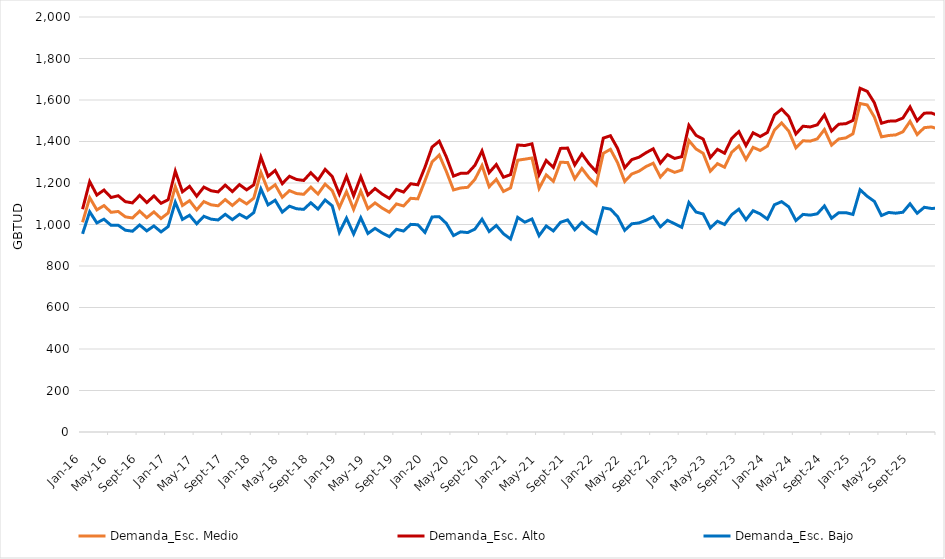
| Category | Demanda_Esc. Medio | Demanda_Esc. Alto | Demanda_Esc. Bajo |
|---|---|---|---|
| 2016-01-01 | 1010.734 | 1073.666 | 954.927 |
| 2016-02-01 | 1129.307 | 1206.771 | 1061.351 |
| 2016-03-01 | 1070.503 | 1141.976 | 1007.813 |
| 2016-04-01 | 1091.194 | 1166.019 | 1025.488 |
| 2016-05-01 | 1058.716 | 1130.053 | 996.106 |
| 2016-06-01 | 1062.896 | 1138.586 | 996.35 |
| 2016-07-01 | 1036.852 | 1109.979 | 972.544 |
| 2016-08-01 | 1031.51 | 1104.188 | 967.604 |
| 2016-09-01 | 1064.389 | 1140.237 | 997.738 |
| 2016-10-01 | 1032.934 | 1105.468 | 969.232 |
| 2016-11-01 | 1060.719 | 1137.541 | 993.082 |
| 2016-12-01 | 1028.868 | 1102.286 | 964.366 |
| 2017-01-01 | 1055.533 | 1119.613 | 990.168 |
| 2017-02-01 | 1182.94 | 1257.065 | 1107.383 |
| 2017-03-01 | 1091.685 | 1157.569 | 1024.487 |
| 2017-04-01 | 1114.927 | 1183.891 | 1044.609 |
| 2017-05-01 | 1070.676 | 1136.464 | 1003.592 |
| 2017-06-01 | 1110.465 | 1180.046 | 1039.523 |
| 2017-07-01 | 1095.1 | 1162.852 | 1026.01 |
| 2017-08-01 | 1090.134 | 1157.118 | 1021.824 |
| 2017-09-01 | 1120.131 | 1189.828 | 1049.068 |
| 2017-10-01 | 1091.687 | 1158.751 | 1023.299 |
| 2017-11-01 | 1121.367 | 1192.191 | 1049.162 |
| 2017-12-01 | 1099.397 | 1166.949 | 1030.51 |
| 2018-01-01 | 1126.968 | 1191.274 | 1057.305 |
| 2018-02-01 | 1250.93 | 1324.812 | 1171.54 |
| 2018-03-01 | 1165.912 | 1231.791 | 1094.654 |
| 2018-04-01 | 1191.479 | 1260.55 | 1116.982 |
| 2018-05-01 | 1131.034 | 1196.868 | 1059.825 |
| 2018-06-01 | 1163.107 | 1232.478 | 1088.309 |
| 2018-07-01 | 1149.161 | 1216.905 | 1075.856 |
| 2018-08-01 | 1145.409 | 1212.289 | 1072.98 |
| 2018-09-01 | 1179.977 | 1249.577 | 1104.785 |
| 2018-10-01 | 1146.779 | 1213.794 | 1074.213 |
| 2018-11-01 | 1194.549 | 1265.261 | 1118.231 |
| 2018-12-01 | 1163.364 | 1231.08 | 1090.087 |
| 2019-01-01 | 1081.791 | 1146.138 | 962.053 |
| 2019-02-01 | 1158.506 | 1232.493 | 1030.717 |
| 2019-03-01 | 1072.963 | 1138.578 | 954.183 |
| 2019-04-01 | 1161.351 | 1230.205 | 1032.548 |
| 2019-05-01 | 1076.207 | 1142.015 | 956.84 |
| 2019-06-01 | 1103.993 | 1173.377 | 981.337 |
| 2019-07-01 | 1079.179 | 1146.661 | 959.28 |
| 2019-08-01 | 1059.191 | 1126.086 | 941.435 |
| 2019-09-01 | 1099.147 | 1168.914 | 976.958 |
| 2019-10-01 | 1089.284 | 1156.364 | 968.533 |
| 2019-11-01 | 1126.177 | 1196.397 | 1000.649 |
| 2019-12-01 | 1123.641 | 1191.227 | 998.837 |
| 2020-01-01 | 1210.807 | 1276.028 | 961.752 |
| 2020-02-01 | 1301.318 | 1373.492 | 1036.386 |
| 2020-03-01 | 1334.861 | 1401.444 | 1037.672 |
| 2020-04-01 | 1255.354 | 1325.206 | 1005.178 |
| 2020-05-01 | 1166.569 | 1233.266 | 946.688 |
| 2020-06-01 | 1176.075 | 1246.52 | 964.435 |
| 2020-07-01 | 1179.229 | 1247.702 | 961.131 |
| 2020-08-01 | 1217.613 | 1285.077 | 977.865 |
| 2020-09-01 | 1283.98 | 1354.614 | 1025.438 |
| 2020-10-01 | 1181.967 | 1249.874 | 966.271 |
| 2020-11-01 | 1217.621 | 1288.957 | 995.399 |
| 2020-12-01 | 1159.326 | 1227.745 | 955.452 |
| 2021-01-01 | 1176.1 | 1240.455 | 929.97 |
| 2021-02-01 | 1309.784 | 1383.254 | 1034.27 |
| 2021-03-01 | 1314.858 | 1380.551 | 1011.142 |
| 2021-04-01 | 1320.409 | 1388.934 | 1026.539 |
| 2021-05-01 | 1173.871 | 1239.619 | 946.167 |
| 2021-06-01 | 1239.173 | 1308.541 | 992.898 |
| 2021-07-01 | 1208.003 | 1275.142 | 969.106 |
| 2021-08-01 | 1300.05 | 1366.729 | 1010.59 |
| 2021-09-01 | 1298.768 | 1368.273 | 1022.029 |
| 2021-10-01 | 1220.357 | 1287.12 | 974.453 |
| 2021-11-01 | 1269.991 | 1340.315 | 1010.505 |
| 2021-12-01 | 1225.21 | 1292.675 | 979.6 |
| 2022-01-01 | 1190.604 | 1255.019 | 957.078 |
| 2022-02-01 | 1342.895 | 1416.52 | 1080.712 |
| 2022-03-01 | 1362.309 | 1427.943 | 1073.9 |
| 2022-04-01 | 1298.144 | 1366.681 | 1038.122 |
| 2022-05-01 | 1207.469 | 1273.385 | 971.921 |
| 2022-06-01 | 1243.558 | 1312.842 | 1003.422 |
| 2022-07-01 | 1256.961 | 1324.156 | 1007.561 |
| 2022-08-01 | 1279.4 | 1346.091 | 1020.442 |
| 2022-09-01 | 1295.374 | 1364.85 | 1037.904 |
| 2022-10-01 | 1228.807 | 1295.747 | 988.901 |
| 2022-11-01 | 1266.389 | 1336.625 | 1020.114 |
| 2022-12-01 | 1251.239 | 1318.463 | 1003.748 |
| 2023-01-01 | 1262.478 | 1326.84 | 986.557 |
| 2023-02-01 | 1404.571 | 1478.161 | 1105.971 |
| 2023-03-01 | 1363.894 | 1429.611 | 1060.013 |
| 2023-04-01 | 1343.03 | 1411.66 | 1050.946 |
| 2023-05-01 | 1256.795 | 1322.509 | 983.548 |
| 2023-06-01 | 1293.133 | 1362.289 | 1015.703 |
| 2023-07-01 | 1276.142 | 1343.458 | 1000.141 |
| 2023-08-01 | 1347.934 | 1414.549 | 1047.172 |
| 2023-09-01 | 1378.46 | 1447.656 | 1073.717 |
| 2023-10-01 | 1313.493 | 1380.359 | 1022.858 |
| 2023-11-01 | 1371.772 | 1441.958 | 1066.634 |
| 2023-12-01 | 1356.754 | 1424.013 | 1050.923 |
| 2024-01-01 | 1377.871 | 1443.393 | 1026.099 |
| 2024-02-01 | 1455.654 | 1527.932 | 1095.296 |
| 2024-03-01 | 1489.41 | 1556.1 | 1110.142 |
| 2024-04-01 | 1449.843 | 1519.733 | 1085.119 |
| 2024-05-01 | 1369.593 | 1436.443 | 1019.163 |
| 2024-06-01 | 1403.612 | 1473.699 | 1048.695 |
| 2024-07-01 | 1401.677 | 1470.092 | 1045.122 |
| 2024-08-01 | 1412.672 | 1480.321 | 1051.513 |
| 2024-09-01 | 1457.694 | 1527.971 | 1089.495 |
| 2024-10-01 | 1382.399 | 1450.324 | 1030.078 |
| 2024-11-01 | 1412.016 | 1483.245 | 1056.813 |
| 2024-12-01 | 1417.388 | 1485.849 | 1057.054 |
| 2025-01-01 | 1437.206 | 1501.626 | 1048.497 |
| 2025-02-01 | 1583.161 | 1656.615 | 1167.462 |
| 2025-03-01 | 1576.068 | 1641.625 | 1135.836 |
| 2025-04-01 | 1518.044 | 1586.652 | 1111.231 |
| 2025-05-01 | 1422.39 | 1488.017 | 1043.249 |
| 2025-06-01 | 1428.958 | 1498.005 | 1058.043 |
| 2025-07-01 | 1431.829 | 1498.984 | 1054.525 |
| 2025-08-01 | 1446.816 | 1513.091 | 1059.126 |
| 2025-09-01 | 1497.201 | 1566.491 | 1099.843 |
| 2025-10-01 | 1433.348 | 1500.071 | 1054.19 |
| 2025-11-01 | 1466.76 | 1536.581 | 1083.051 |
| 2025-12-01 | 1470.209 | 1537.321 | 1077.203 |
| 2026-01-01 | 1460.018 | 1524.452 | 1078.923 |
| 2026-02-01 | 1611.201 | 1684.484 | 1201.848 |
| 2026-03-01 | 1662.268 | 1727.846 | 1207.002 |
| 2026-04-01 | 1529.855 | 1598.372 | 1135.643 |
| 2026-05-01 | 1393.097 | 1458.549 | 1040.894 |
| 2026-06-01 | 1439.412 | 1508.547 | 1081.519 |
| 2026-07-01 | 1446.974 | 1513.94 | 1079.342 |
| 2026-08-01 | 1422.571 | 1489.043 | 1062.058 |
| 2026-09-01 | 1477.904 | 1547.074 | 1104.787 |
| 2026-10-01 | 1418.577 | 1485.24 | 1061.282 |
| 2026-11-01 | 1465.107 | 1534.959 | 1098.739 |
| 2026-12-01 | 1472.501 | 1539.637 | 1095.606 |
| 2027-01-01 | 1486.915 | 1551.326 | 1104.921 |
| 2027-02-01 | 1609.784 | 1683.113 | 1211.551 |
| 2027-03-01 | 1621.972 | 1687.467 | 1189.263 |
| 2027-04-01 | 1518.804 | 1587.188 | 1138.469 |
| 2027-05-01 | 1421.855 | 1487.447 | 1070.303 |
| 2027-06-01 | 1457.836 | 1526.809 | 1103.563 |
| 2027-07-01 | 1447.861 | 1514.64 | 1089.975 |
| 2027-08-01 | 1470.638 | 1537.082 | 1101.643 |
| 2027-09-01 | 1546.303 | 1615.391 | 1156.175 |
| 2027-10-01 | 1449.257 | 1515.819 | 1090.339 |
| 2027-11-01 | 1496.55 | 1566.304 | 1128.321 |
| 2027-12-01 | 1540.019 | 1607.043 | 1145.463 |
| 2028-01-01 | 1579.642 | 1645.124 | 1142.03 |
| 2028-02-01 | 1698.531 | 1770.534 | 1233.662 |
| 2028-03-01 | 1672.488 | 1739.147 | 1194.126 |
| 2028-04-01 | 1625.223 | 1694.673 | 1183.787 |
| 2028-05-01 | 1468.065 | 1534.962 | 1093.495 |
| 2028-06-01 | 1474.776 | 1544.872 | 1111.574 |
| 2028-07-01 | 1510.049 | 1578.062 | 1119.612 |
| 2028-08-01 | 1579.521 | 1647.009 | 1149.954 |
| 2028-09-01 | 1613.945 | 1684.133 | 1180.04 |
| 2028-10-01 | 1499.155 | 1567.014 | 1113.839 |
| 2028-11-01 | 1526.269 | 1597.156 | 1139.72 |
| 2028-12-01 | 1581.357 | 1649.326 | 1153.63 |
| 2029-01-01 | 1643.929 | 1708.167 | 1163.436 |
| 2029-02-01 | 1783.756 | 1856.923 | 1277.45 |
| 2029-03-01 | 1770.807 | 1836.179 | 1226.236 |
| 2029-04-01 | 1684.253 | 1752.379 | 1203.385 |
| 2029-05-01 | 1478.875 | 1544.539 | 1098.904 |
| 2029-06-01 | 1532.3 | 1601.061 | 1139.071 |
| 2029-07-01 | 1608.931 | 1675.602 | 1161.547 |
| 2029-08-01 | 1585.265 | 1651.512 | 1147.294 |
| 2029-09-01 | 1702.886 | 1771.717 | 1213.497 |
| 2029-10-01 | 1587.314 | 1653.834 | 1151.604 |
| 2029-11-01 | 1632.369 | 1701.854 | 1185.727 |
| 2029-12-01 | 1654.417 | 1721.072 | 1180.314 |
| 2030-01-01 | 1695.054 | 1760.315 | 1187.565 |
| 2030-02-01 | 1805.447 | 1879.806 | 1290.165 |
| 2030-03-01 | 1798.585 | 1865.013 | 1238.469 |
| 2030-04-01 | 1746.679 | 1815.866 | 1232.793 |
| 2030-05-01 | 1524.95 | 1591.632 | 1124.974 |
| 2030-06-01 | 1601.767 | 1671.568 | 1174.741 |
| 2030-07-01 | 1689.446 | 1757.115 | 1199.265 |
| 2030-08-01 | 1672.473 | 1739.699 | 1187.994 |
| 2030-09-01 | 1751.721 | 1821.601 | 1236.862 |
| 2030-10-01 | 1617.666 | 1685.213 | 1169.052 |
| 2030-11-01 | 1702.637 | 1773.147 | 1219.573 |
| 2030-12-01 | 1728.84 | 1796.471 | 1214.276 |
| 2031-01-01 | 1573.363 | 1638.775 | 1176.959 |
| 2031-02-01 | 1700.972 | 1775.469 | 1289.387 |
| 2031-03-01 | 1673.69 | 1740.237 | 1236.951 |
| 2031-04-01 | 1627.603 | 1696.913 | 1224.412 |
| 2031-05-01 | 1501.718 | 1568.438 | 1144.162 |
| 2031-06-01 | 1558.252 | 1628.101 | 1188.372 |
| 2031-07-01 | 1587.404 | 1655.164 | 1195.153 |
| 2031-08-01 | 1589.818 | 1657.111 | 1193.063 |
| 2031-09-01 | 1652.308 | 1722.255 | 1238.983 |
| 2031-10-01 | 1605.832 | 1673.368 | 1204.358 |
| 2031-11-01 | 1622.794 | 1693.346 | 1225.378 |
| 2031-12-01 | 1600.07 | 1667.772 | 1200.87 |
| 2032-01-01 | 1538.7 | 1604.152 | 1169.828 |
| 2032-02-01 | 1671.189 | 1745.716 | 1285.916 |
| 2032-03-01 | 1646.445 | 1713.05 | 1235.247 |
| 2032-04-01 | 1619.301 | 1688.649 | 1232.276 |
| 2032-05-01 | 1500.797 | 1567.537 | 1154.577 |
| 2032-06-01 | 1546.219 | 1616.089 | 1193.187 |
| 2032-07-01 | 1533.004 | 1600.808 | 1177.243 |
| 2032-08-01 | 1545.077 | 1612.392 | 1180.473 |
| 2032-09-01 | 1614.63 | 1684.582 | 1230.848 |
| 2032-10-01 | 1575.548 | 1643.074 | 1199.804 |
| 2032-11-01 | 1598.833 | 1669.358 | 1224.274 |
| 2032-12-01 | 1551.573 | 1619.265 | 1186.214 |
| 2033-01-01 | 1547.896 | 1613.415 | 1177.928 |
| 2033-02-01 | 1681.526 | 1756.125 | 1295.004 |
| 2033-03-01 | 1648.903 | 1715.521 | 1237.165 |
| 2033-04-01 | 1625.894 | 1695.244 | 1238.145 |
| 2033-05-01 | 1503.294 | 1570.03 | 1160.316 |
| 2033-06-01 | 1540.392 | 1610.26 | 1194.59 |
| 2033-07-01 | 1531.75 | 1599.546 | 1180.574 |
| 2033-08-01 | 1546.801 | 1614.097 | 1184.69 |
| 2033-09-01 | 1610.483 | 1680.411 | 1231.184 |
| 2033-10-01 | 1580.877 | 1648.36 | 1205.177 |
| 2033-11-01 | 1577.508 | 1648.006 | 1216.211 |
| 2033-12-01 | 1544.981 | 1612.624 | 1185.92 |
| 2034-01-01 | 1558.484 | 1624.04 | 1188.725 |
| 2034-02-01 | 1703.91 | 1778.534 | 1312.352 |
| 2034-03-01 | 1660.613 | 1727.255 | 1247.552 |
| 2034-04-01 | 1631.583 | 1700.955 | 1246.318 |
| 2034-05-01 | 1494.582 | 1561.347 | 1162.001 |
| 2034-06-01 | 1541.163 | 1611.042 | 1201.289 |
| 2034-07-01 | 1558.838 | 1626.612 | 1200.259 |
| 2034-08-01 | 1558.217 | 1625.5 | 1196.046 |
| 2034-09-01 | 1643.216 | 1713.104 | 1253.156 |
| 2034-10-01 | 1597.42 | 1664.87 | 1218.757 |
| 2034-11-01 | 1604.827 | 1675.27 | 1235.848 |
| 2034-12-01 | 1569.326 | 1636.91 | 1203.794 |
| 2035-01-01 | 1580.817 | 1646.409 | 1204.987 |
| 2035-02-01 | 1710.073 | 1784.748 | 1321.01 |
| 2035-03-01 | 1675.869 | 1742.539 | 1259.409 |
| 2035-04-01 | 1662.086 | 1731.463 | 1266.577 |
| 2035-05-01 | 1508.899 | 1575.673 | 1175.044 |
| 2035-06-01 | 1560.985 | 1630.859 | 1217.149 |
| 2035-07-01 | 1590.987 | 1658.738 | 1221.623 |
| 2035-08-01 | 1590.911 | 1658.162 | 1217.503 |
| 2035-09-01 | 1658.051 | 1727.916 | 1265.343 |
| 2035-10-01 | 1617.634 | 1685.047 | 1233.618 |
| 2035-11-01 | 1635.062 | 1705.448 | 1256.101 |
| 2035-12-01 | 1602.58 | 1670.098 | 1225.331 |
| 2036-01-01 | 1549.137 | 1614.82 | 1203.823 |
| 2036-02-01 | 1683.291 | 1758.052 | 1323.545 |
| 2036-03-01 | 1632.036 | 1698.784 | 1255.604 |
| 2036-04-01 | 1630.122 | 1699.562 | 1267.074 |
| 2036-05-01 | 1506.689 | 1573.488 | 1185.745 |
| 2036-06-01 | 1556.436 | 1626.329 | 1227.427 |
| 2036-07-01 | 1577.77 | 1645.538 | 1229.81 |
| 2036-08-01 | 1586.287 | 1653.535 | 1230.794 |
| 2036-09-01 | 1656.435 | 1726.284 | 1282.081 |
| 2036-10-01 | 1644.432 | 1711.795 | 1265.176 |
| 2036-11-01 | 1638.036 | 1708.382 | 1273.934 |
| 2036-12-01 | 1587.142 | 1654.628 | 1233.043 |
| 2037-01-01 | 1534.164 | 1599.919 | 1200.692 |
| 2037-02-01 | 1674.336 | 1749.161 | 1324.343 |
| 2037-03-01 | 1620.362 | 1687.157 | 1254.888 |
| 2037-04-01 | 1628.526 | 1697.997 | 1271.748 |
| 2037-05-01 | 1522.42 | 1589.221 | 1199.077 |
| 2037-06-01 | 1569.541 | 1639.431 | 1239.507 |
| 2037-07-01 | 1573.588 | 1641.357 | 1232.554 |
| 2037-08-01 | 1578.027 | 1645.272 | 1231.361 |
| 2037-09-01 | 1653.444 | 1723.274 | 1285.988 |
| 2037-10-01 | 1672.536 | 1739.845 | 1286.418 |
| 2037-11-01 | 1636.037 | 1706.345 | 1278.125 |
| 2037-12-01 | 1558.239 | 1625.705 | 1221.967 |
| 2038-01-01 | 1536.161 | 1601.964 | 1206.127 |
| 2038-02-01 | 1681.925 | 1756.791 | 1333.478 |
| 2038-03-01 | 1609.641 | 1676.479 | 1253.724 |
| 2038-04-01 | 1625.366 | 1694.866 | 1274.718 |
| 2038-05-01 | 1525.071 | 1591.886 | 1204.582 |
| 2038-06-01 | 1572.202 | 1642.098 | 1245.171 |
| 2038-07-01 | 1573.254 | 1641.022 | 1236.667 |
| 2038-08-01 | 1585.739 | 1652.968 | 1240.085 |
| 2038-09-01 | 1650.226 | 1720.041 | 1288.95 |
| 2038-10-01 | 1671.377 | 1738.661 | 1290.841 |
| 2038-11-01 | 1625.432 | 1695.714 | 1276.665 |
| 2038-12-01 | 1555.455 | 1622.88 | 1224.43 |
| 2039-01-01 | 1547.03 | 1612.879 | 1209.117 |
| 2039-02-01 | 1692.866 | 1767.775 | 1336.104 |
| 2039-03-01 | 1625.518 | 1692.379 | 1257.342 |
| 2039-04-01 | 1647.983 | 1717.493 | 1282.604 |
| 2039-05-01 | 1532.653 | 1599.481 | 1206.573 |
| 2039-06-01 | 1582.578 | 1652.476 | 1248.423 |
| 2039-07-01 | 1603.396 | 1671.138 | 1249.342 |
| 2039-08-01 | 1621.583 | 1688.773 | 1254.946 |
| 2039-09-01 | 1696.989 | 1766.746 | 1308.592 |
| 2039-10-01 | 1690.999 | 1758.242 | 1294.246 |
| 2039-11-01 | 1664.117 | 1734.328 | 1293 |
| 2039-12-01 | 1574.684 | 1642.048 | 1231.533 |
| 2040-01-01 | 1561.034 | 1626.928 | 1212.93 |
| 2040-02-01 | 1715.536 | 1790.479 | 1343.799 |
| 2040-03-01 | 1669.304 | 1736.168 | 1273.789 |
| 2040-04-01 | 1685.091 | 1754.598 | 1296.16 |
| 2040-05-01 | 1552.358 | 1619.189 | 1213.992 |
| 2040-06-01 | 1598.807 | 1668.702 | 1253.797 |
| 2040-07-01 | 1635.293 | 1703.009 | 1260.805 |
| 2040-08-01 | 1662.416 | 1729.564 | 1269.838 |
| 2040-09-01 | 1731.577 | 1801.29 | 1319.04 |
| 2040-10-01 | 1733.266 | 1800.452 | 1307.648 |
| 2040-11-01 | 1702.607 | 1772.748 | 1306.561 |
| 2040-12-01 | 1591.777 | 1659.083 | 1236.182 |